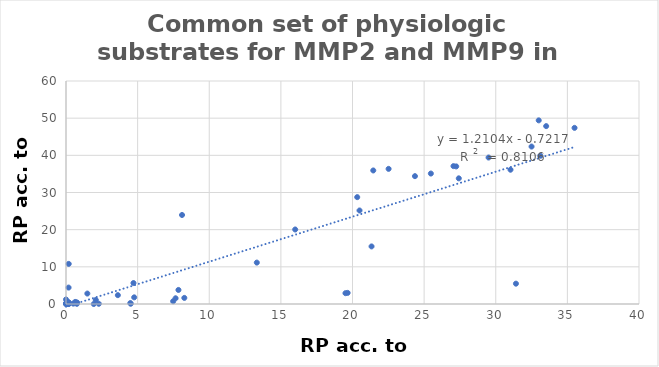
| Category | Relative probability (RP), acc. to MMP9 |
|---|---|
| 0.76 | 0.05 |
| 4.71 | 5.64 |
| 0.04 | 0.33 |
| 0.64 | 0.56 |
| 7.85 | 3.78 |
| 3.62 | 2.38 |
| 0.78 | 0.38 |
| 0.14 | 0.09 |
| 0.18 | 4.42 |
| 1.49 | 2.81 |
| 0.73 | 0.37 |
| 0.14 | 0.27 |
| 2.29 | 0.06 |
| 19.51 | 2.91 |
| 31.41 | 5.47 |
| 4.76 | 1.79 |
| 20.33 | 28.75 |
| 4.52 | 0.07 |
| 0.16 | 0 |
| 0.05 | 0.06 |
| 22.52 | 36.36 |
| 29.5 | 39.41 |
| 16.0 | 20.05 |
| 27.42 | 33.81 |
| 0.12 | 0.05 |
| 8.26 | 1.64 |
| 0.0 | 1.22 |
| 21.45 | 35.93 |
| 8.1 | 23.95 |
| 0.0 | 0.07 |
| 0.0 | 0.11 |
| 0.14 | 0 |
| 0.14 | 0 |
| 24.36 | 34.4 |
| 0.1 | 0.2 |
| 27.05 | 37.1 |
| 33.52 | 47.86 |
| 0.04 | 0.35 |
| 0.16 | 0.48 |
| 2.08 | 1.08 |
| 35.5 | 47.39 |
| 7.65 | 1.54 |
| 27.24 | 37.02 |
| 20.49 | 25.16 |
| 0.04 | 0 |
| 33.11 | 39.89 |
| 0.04 | 0.05 |
| 13.32 | 11.14 |
| 31.03 | 36.13 |
| 25.47 | 35.1 |
| 32.5 | 42.36 |
| 33.0 | 49.41 |
| 1.94 | 0 |
| 7.48 | 0.74 |
| 0.0 | 0 |
| 0.19 | 10.79 |
| 4.49 | 0.25 |
| 0.51 | 0.1 |
| 0.24 | 0.21 |
| 19.66 | 2.99 |
| 21.33 | 15.49 |
| 0.18 | 0.46 |